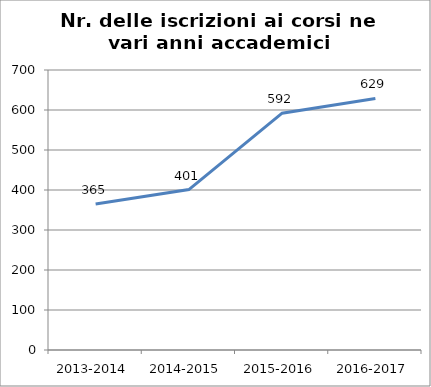
| Category | Nr. Iscrizioni ai Corsi |
|---|---|
| 2013-2014 | 365 |
| 2014-2015 | 401 |
| 2015-2016 | 592 |
| 2016-2017 | 629 |